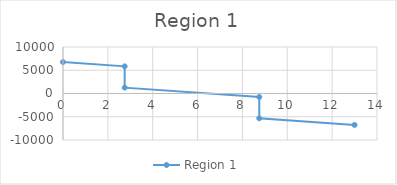
| Category | Region 1 |
|---|---|
| 0.0 | 6761.378 |
| 2.75 | 5836.058 |
| 2.75 | 1261.8 |
| 8.75 | -757.08 |
| 8.75 | -5331.338 |
| 13.0 | -6761.378 |